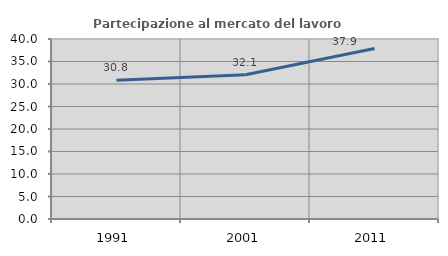
| Category | Partecipazione al mercato del lavoro  femminile |
|---|---|
| 1991.0 | 30.813 |
| 2001.0 | 32.052 |
| 2011.0 | 37.895 |